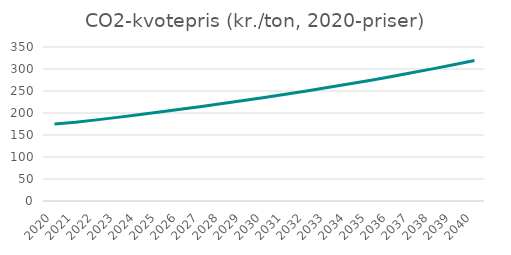
| Category | Series 0 |
|---|---|
| 2020.0 | 174.762 |
| 2021.0 | 178.821 |
| 2022.0 | 184.358 |
| 2023.0 | 190.066 |
| 2024.0 | 195.95 |
| 2025.0 | 202.017 |
| 2026.0 | 208.272 |
| 2027.0 | 214.72 |
| 2028.0 | 221.368 |
| 2029.0 | 228.222 |
| 2030.0 | 235.288 |
| 2031.0 | 242.572 |
| 2032.0 | 250.082 |
| 2033.0 | 257.825 |
| 2034.0 | 265.808 |
| 2035.0 | 274.037 |
| 2036.0 | 282.522 |
| 2037.0 | 291.269 |
| 2038.0 | 300.287 |
| 2039.0 | 309.584 |
| 2040.0 | 319.169 |